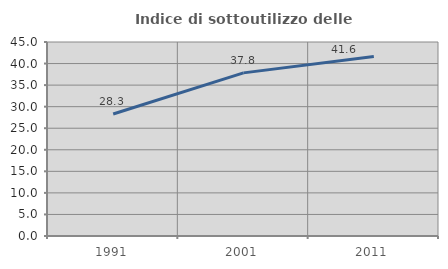
| Category | Indice di sottoutilizzo delle abitazioni  |
|---|---|
| 1991.0 | 28.293 |
| 2001.0 | 37.838 |
| 2011.0 | 41.64 |